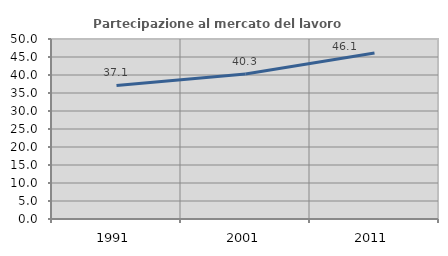
| Category | Partecipazione al mercato del lavoro  femminile |
|---|---|
| 1991.0 | 37.092 |
| 2001.0 | 40.294 |
| 2011.0 | 46.094 |